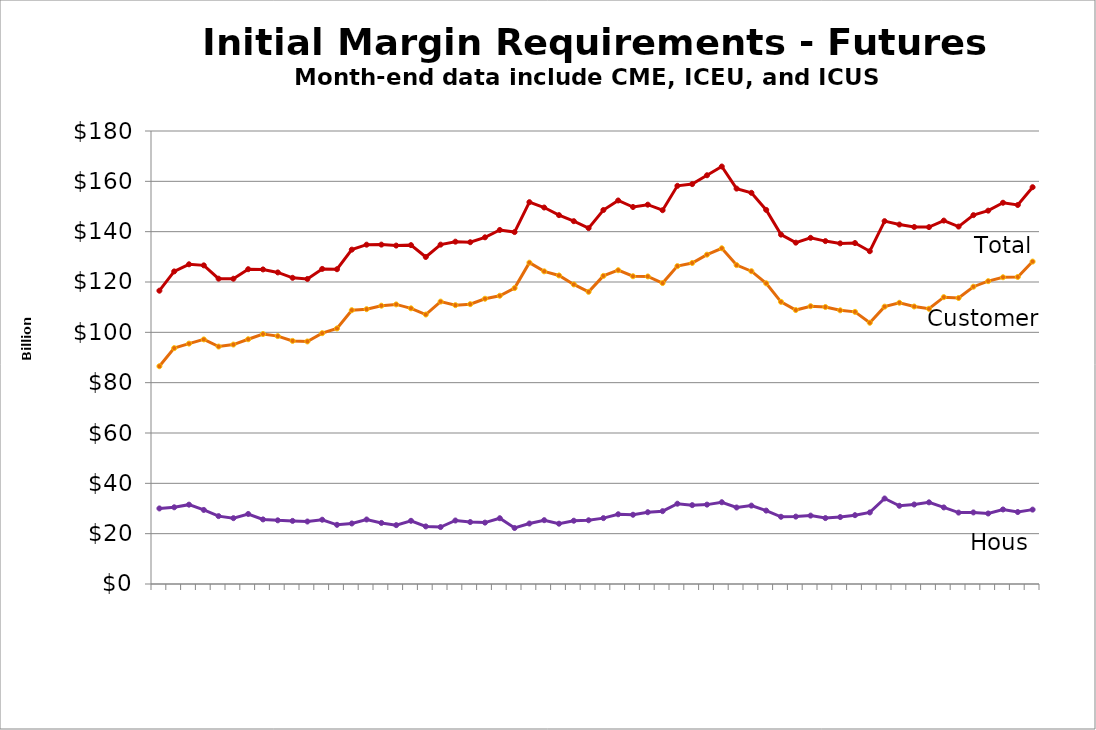
| Category | Customer | House | Total |
|---|---|---|---|
| nan |  |  |  |
| 2014-01-31 |  |  |  |
| nan |  |  |  |
| 2014-03-31 |  |  |  |
| nan |  |  |  |
| 2014-05-30 |  |  |  |
| nan |  |  |  |
| 2014-07-31 |  |  |  |
| nan |  |  |  |
| 2014-09-30 |  |  |  |
| nan |  |  |  |
| 2014-11-28 |  |  |  |
| nan |  |  |  |
| 2015-01-30 |  |  |  |
| nan |  |  |  |
| 2015-03-31 |  |  |  |
| nan |  |  |  |
| 2015-05-29 |  |  |  |
| nan |  |  |  |
| 2015-07-31 |  |  |  |
| nan |  |  |  |
| 2015-09-30 |  |  |  |
| nan |  |  |  |
| 2015-11-30 |  |  |  |
| nan |  |  |  |
| 2016-01-29 |  |  |  |
| nan |  |  |  |
| 2016-03-31 |  |  |  |
| nan |  |  |  |
| 2016-05-31 |  |  |  |
| nan |  |  |  |
| 2016-07-29 |  |  |  |
| nan |  |  |  |
| 2016-09-30 |  |  |  |
| nan |  |  |  |
| 2016-11-30 |  |  |  |
| nan |  |  |  |
| 2017-01-31 |  |  |  |
| nan |  |  |  |
| 2017-03-31 |  |  |  |
| nan |  |  |  |
| 2017-05-31 |  |  |  |
| nan |  |  |  |
| 2017-07-31 |  |  |  |
| nan |  |  |  |
| 2017-09-29 |  |  |  |
| nan |  |  |  |
| 2017-11-30 |  |  |  |
| nan |  |  |  |
| 2018-01-31 |  |  |  |
| nan |  |  |  |
| 2018-03-29 |  |  |  |
| nan |  |  |  |
| 2018-05-31 |  |  |  |
| nan |  |  |  |
| 2018-07-31 |  |  |  |
| nan |  |  |  |
| 2018-09-28 |  |  |  |
| nan |  |  |  |
| 2018-11-30 |  |  |  |